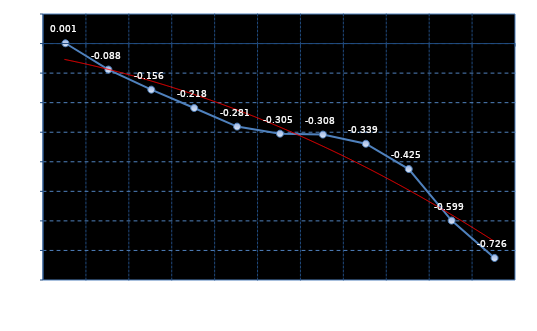
| Category | Series 0 |
|---|---|
| NGES1G | 0.001 |
| NGES2G | -0.088 |
| NGES3G | -0.156 |
| NGES4G | -0.218 |
| NGES5G | -0.281 |
| NGES6G | -0.305 |
| NGES7G | -0.308 |
| NGES8G | -0.339 |
| NGES9G | -0.424 |
| NGES10G | -0.599 |
| NGES11G | -0.726 |